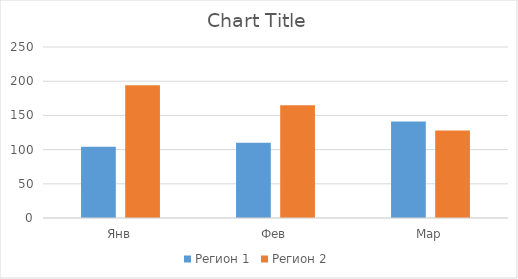
| Category | Регион 1 | Регион 2 |
|---|---|---|
| Янв | 104 | 194 |
| Фев | 110 | 165 |
| Мар | 141 | 128 |